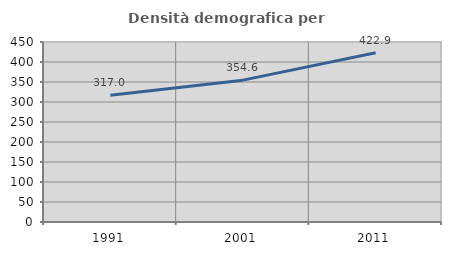
| Category | Densità demografica |
|---|---|
| 1991.0 | 317.019 |
| 2001.0 | 354.644 |
| 2011.0 | 422.899 |